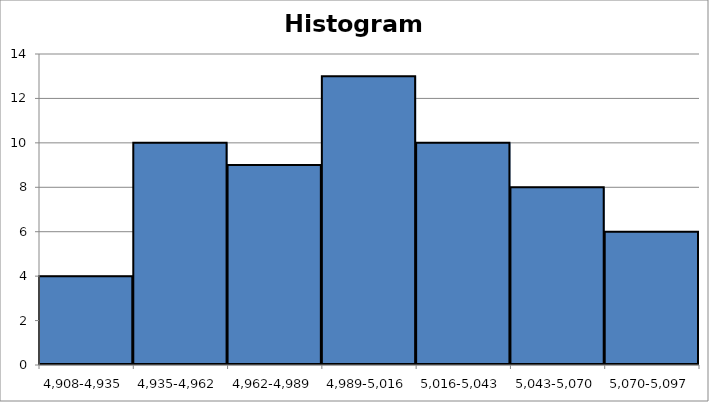
| Category | Frecuencia |
|---|---|
| 4,908-4,935 | 4 |
| 4,935-4,962 | 10 |
| 4,962-4,989 | 9 |
| 4,989-5,016 | 13 |
| 5,016-5,043 | 10 |
| 5,043-5,070 | 8 |
| 5,070-5,097 | 6 |